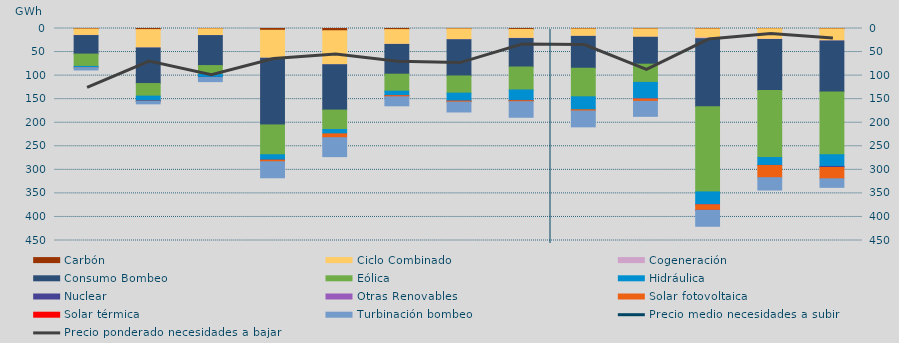
| Category | Carbón | Ciclo Combinado | Cogeneración | Consumo Bombeo | Eólica | Hidráulica | Nuclear | Otras Renovables | Solar fotovoltaica | Solar térmica | Turbinación bombeo |
|---|---|---|---|---|---|---|---|---|---|---|---|
| 0 | 1032.05 | 13586.525 | 372.15 | 39287.3 | 26177.05 | 2674.925 | 0 | 0 | 91.5 | 0 | 4779.4 |
| 1 | 2338.05 | 38734.9 | 425.275 | 75366.15 | 26713.775 | 10087.325 | 758.925 | 0 | 314.05 | 0 | 5208.05 |
| 2 | 607 | 14346.825 | 84.1 | 63631.75 | 18608.375 | 6324.8 | 376.5 | 0.25 | 124.625 | 0 | 8670.125 |
| 3 | 3747 | 59427.025 | 92.6 | 141431.55 | 63317 | 11208.6 | 225.6 | 0 | 3390.725 | 0 | 34005.35 |
| 4 | 4777.9 | 72027.575 | 369 | 96009.825 | 41297.175 | 9161.725 | 0 | 0 | 8173.5 | 0 | 40164.95 |
| 5 | 2339.95 | 31212.45 | 309 | 63146.125 | 35992.6 | 9536.075 | 20 | 0 | 2519.6 | 0 | 19037.975 |
| 6 | 804 | 22741.325 | 259.55 | 76959.4 | 36430.1 | 16893 | 82 | 0 | 2101.325 | 0 | 20947.55 |
| 7 | 1954 | 18792.9 | 569.425 | 60395.65 | 48803.7 | 22168.6 | 540.725 | 0 | 2191.975 | 0 | 32969.35 |
| 8 | 1013 | 15498.975 | 284.05 | 67580.25 | 60658.55 | 27501.4 | 0 | 0 | 2682.825 | 0 | 33526.625 |
| 9 | 883 | 17650.875 | 181.5 | 57086.475 | 38624.325 | 35109.7 | 186 | 16 | 4912.925 | 0 | 31800.3 |
| 10 | 906 | 19278.9 | 1400.95 | 144482.175 | 180813.55 | 26734.575 | 692.75 | 22 | 11477.9 | 11 | 34001.625 |
| 11 | 552 | 22218.15 | 797.8 | 108258.5 | 142089.65 | 16666.15 | 246.5 | 0 | 25852.05 | 0 | 26149.6 |
| 12 | 807.25 | 25335.65 | 347.3 | 108093.3 | 133344.025 | 24879.7 | 2223.5 | 0 | 24040.15 | 0 | 18092.95 |